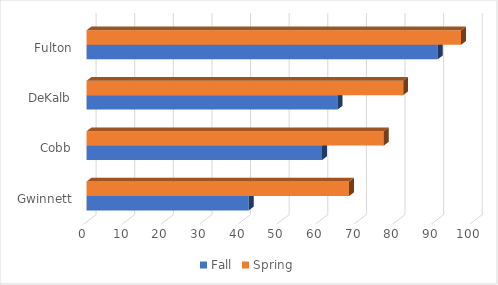
| Category | Fall | Spring |
|---|---|---|
| Gwinnett | 42 | 68 |
| Cobb | 61 | 77 |
| DeKalb | 65 | 82 |
| Fulton | 91 | 97 |